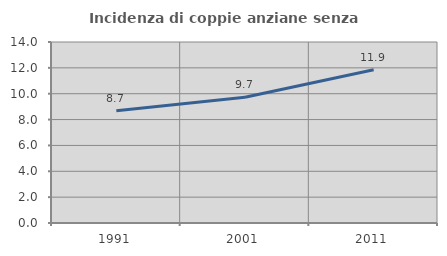
| Category | Incidenza di coppie anziane senza figli  |
|---|---|
| 1991.0 | 8.675 |
| 2001.0 | 9.726 |
| 2011.0 | 11.856 |